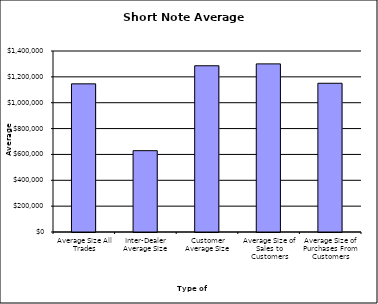
| Category | Security Type |
|---|---|
| Average Size All Trades | 1145940.603 |
| Inter-Dealer Average Size | 628990.476 |
| Customer Average Size | 1285836.9 |
| Average Size of Sales to Customers | 1300398.813 |
| Average Size of Purchases From Customers | 1150398.23 |